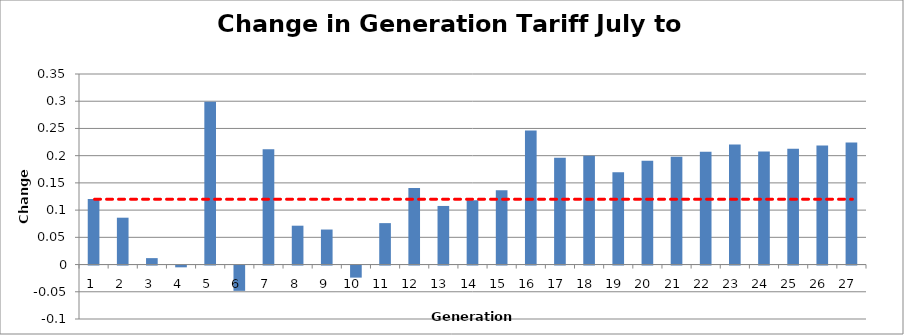
| Category | Change from May forecast |
|---|---|
| 1.0 | 0.121 |
| 2.0 | 0.086 |
| 3.0 | 0.012 |
| 4.0 | -0.003 |
| 5.0 | 0.299 |
| 6.0 | -0.046 |
| 7.0 | 0.212 |
| 8.0 | 0.071 |
| 9.0 | 0.064 |
| 10.0 | -0.022 |
| 11.0 | 0.076 |
| 12.0 | 0.141 |
| 13.0 | 0.108 |
| 14.0 | 0.118 |
| 15.0 | 0.136 |
| 16.0 | 0.246 |
| 17.0 | 0.196 |
| 18.0 | 0.2 |
| 19.0 | 0.17 |
| 20.0 | 0.19 |
| 21.0 | 0.198 |
| 22.0 | 0.207 |
| 23.0 | 0.221 |
| 24.0 | 0.208 |
| 25.0 | 0.213 |
| 26.0 | 0.219 |
| 27.0 | 0.224 |